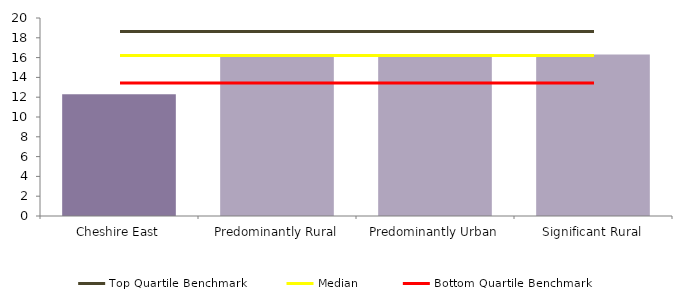
| Category | Series 0 |
|---|---|
| Cheshire East | 12.305 |
| Predominantly Rural | 16.107 |
| Predominantly Urban | 16.233 |
| Significant Rural | 16.303 |